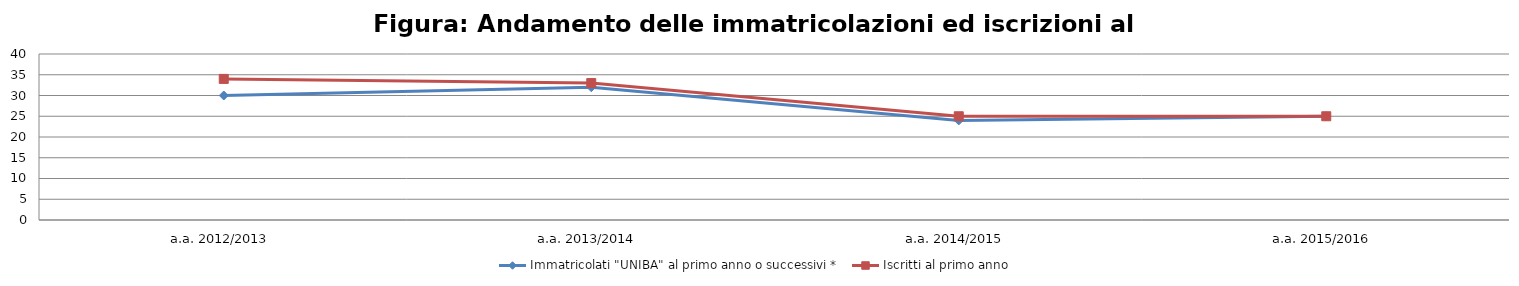
| Category | Immatricolati "UNIBA" al primo anno o successivi * | Iscritti al primo anno  |
|---|---|---|
| a.a. 2012/2013 | 30 | 34 |
| a.a. 2013/2014 | 32 | 33 |
| a.a. 2014/2015 | 24 | 25 |
| a.a. 2015/2016 | 25 | 25 |